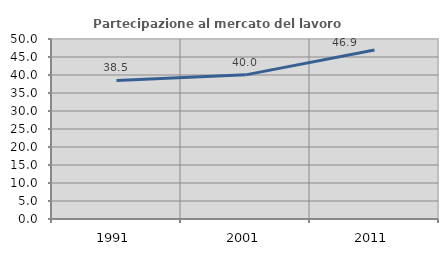
| Category | Partecipazione al mercato del lavoro  femminile |
|---|---|
| 1991.0 | 38.497 |
| 2001.0 | 40.037 |
| 2011.0 | 46.946 |